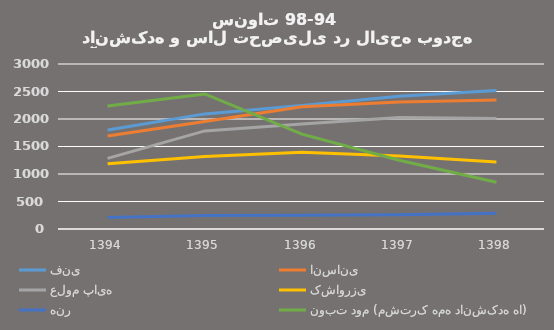
| Category | فنی | انسانی | علوم پایه | کشاورزی | هنر | نوبت دوم (مشترک همه دانشکده ها) |
|---|---|---|---|---|---|---|
| 1394.0 | 1800 | 1691 | 1285 | 1186 | 207 | 2238 |
| 1395.0 | 2093 | 1955 | 1784 | 1319 | 244 | 2455 |
| 1396.0 | 2244 | 2224 | 1911 | 1396 | 252 | 1724 |
| 1397.0 | 2412 | 2309 | 2025 | 1329 | 258 | 1249 |
| 1398.0 | 2519 | 2347 | 2009 | 1218 | 288 | 851 |